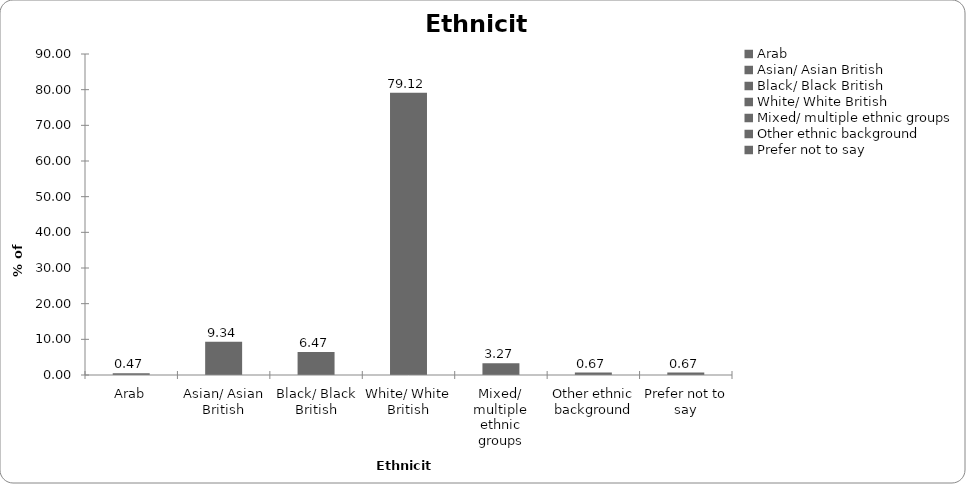
| Category | Ethnicity |
|---|---|
| Arab | 0.467 |
| Asian/ Asian British | 9.34 |
| Black/ Black British | 6.471 |
| White/ White British | 79.119 |
| Mixed/ multiple ethnic groups | 3.269 |
| Other ethnic background | 0.667 |
| Prefer not to say | 0.667 |